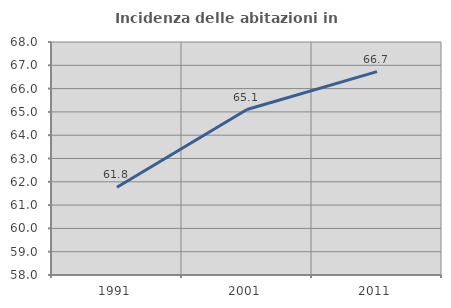
| Category | Incidenza delle abitazioni in proprietà  |
|---|---|
| 1991.0 | 61.764 |
| 2001.0 | 65.103 |
| 2011.0 | 66.73 |